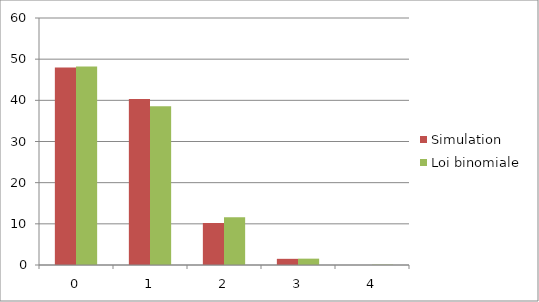
| Category | Simulation | Loi binomiale |
|---|---|---|
| 0.0 | 48 | 48.225 |
| 1.0 | 40.3 | 38.58 |
| 2.0 | 10.2 | 11.574 |
| 3.0 | 1.5 | 1.543 |
| 4.0 | 0 | 0.077 |